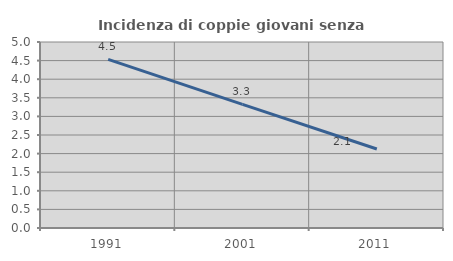
| Category | Incidenza di coppie giovani senza figli |
|---|---|
| 1991.0 | 4.531 |
| 2001.0 | 3.322 |
| 2011.0 | 2.124 |